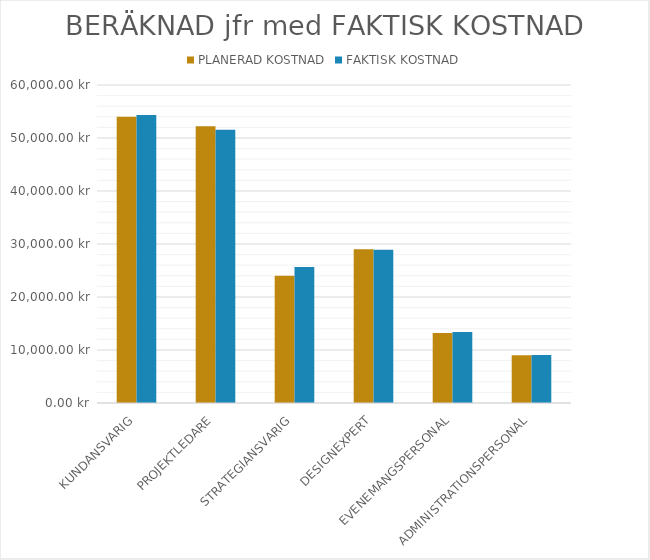
| Category | PLANERAD KOSTNAD | FAKTISK KOSTNAD |
|---|---|---|
| KUNDANSVARIG | 54000 | 54360 |
| PROJEKTLEDARE | 52200 | 51540 |
| STRATEGIANSVARIG | 24000 | 25650 |
| DESIGNEXPERT | 29000 | 28900 |
| EVENEMANGSPERSONAL | 13200 | 13400 |
| ADMINISTRATIONSPERSONAL | 9000 | 9060 |